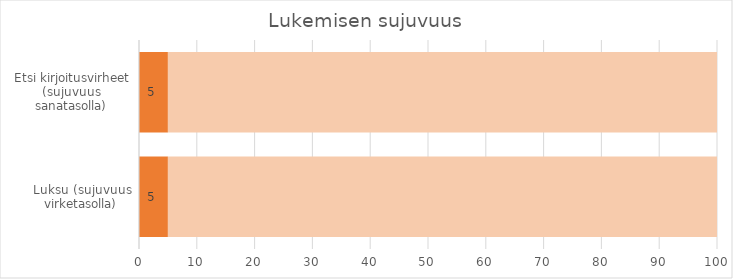
| Category | Series 0 | 95 |
|---|---|---|
| Luksu (sujuvuus virketasolla) | 5 | 95 |
| Etsi kirjoitusvirheet (sujuvuus sanatasolla) | 5 | 95 |